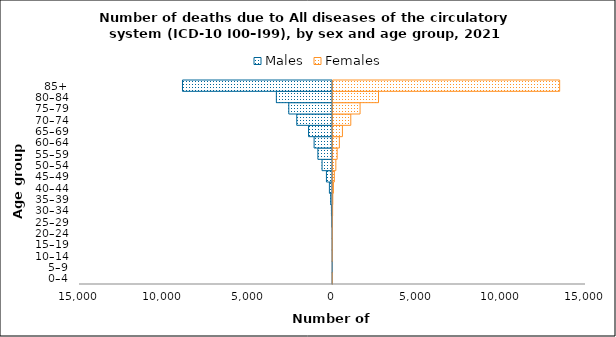
| Category | Males | Females |
|---|---|---|
| 0–4 | -7 | 8 |
| 5–9 | -3 | 0 |
| 10–14 | -1 | 3 |
| 15–19 | -4 | 5 |
| 20–24 | -15 | 12 |
| 25–29 | -36 | 18 |
| 30–34 | -62 | 37 |
| 35–39 | -106 | 49 |
| 40–44 | -184 | 84 |
| 45–49 | -360 | 139 |
| 50–54 | -619 | 227 |
| 55–59 | -867 | 306 |
| 60–64 | -1090 | 438 |
| 65–69 | -1420 | 618 |
| 70–74 | -2119 | 1114 |
| 75–79 | -2592 | 1664 |
| 80–84 | -3328 | 2757 |
| 85+ | -8895 | 13498 |